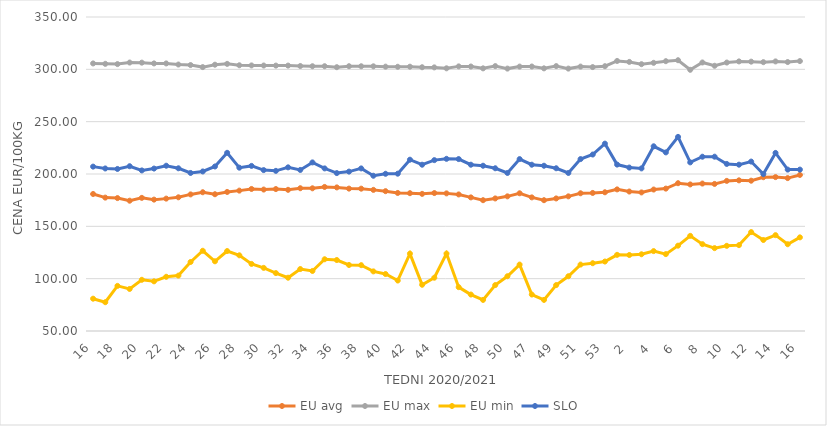
| Category | EU avg | EU max | EU min | SLO |
|---|---|---|---|---|
| 16.0 | 180.892 | 305.63 | 80.873 | 207.05 |
| 17.0 | 177.437 | 305.27 | 77.506 | 205.29 |
| 18.0 | 176.995 | 305.01 | 93.104 | 204.82 |
| 19.0 | 174.49 | 306.49 | 90.169 | 207.44 |
| 20.0 | 177.204 | 306.38 | 98.928 | 203.41 |
| 21.0 | 175.519 | 305.66 | 97.454 | 205.19 |
| 22.0 | 176.473 | 305.64 | 101.792 | 207.91 |
| 23.0 | 177.741 | 304.59 | 102.918 | 205.46 |
| 24.0 | 180.501 | 304.1 | 115.936 | 201 |
| 25.0 | 182.568 | 302.13 | 126.655 | 202.43 |
| 26.0 | 180.667 | 304.43 | 116.597 | 207.19 |
| 27.0 | 182.833 | 305.22 | 126.397 | 220.25 |
| 28.0 | 184.121 | 303.88 | 122.317 | 206.06 |
| 29.0 | 185.712 | 303.73 | 114.082 | 207.73 |
| 30.0 | 185.141 | 303.63 | 110.314 | 203.73 |
| 31.0 | 185.621 | 303.57 | 105.336 | 203 |
| 32.0 | 184.887 | 303.58 | 100.908 | 206.36 |
| 33.0 | 186.411 | 303.17 | 109.191 | 203.88 |
| 34.0 | 186.338 | 302.96 | 107.355 | 211.07 |
| 35.0 | 187.628 | 302.99 | 118.534 | 205.34 |
| 36.0 | 187.19 | 302.05 | 117.814 | 200.88 |
| 37.0 | 186.038 | 302.98 | 113.058 | 202.29 |
| 38.0 | 185.986 | 302.94 | 112.896 | 205.33 |
| 39.0 | 184.836 | 302.88 | 106.953 | 198.33 |
| 40.0 | 183.595 | 302.56 | 104.426 | 200.21 |
| 41.0 | 181.893 | 302.44 | 98.23 | 200.3 |
| 42.0 | 181.671 | 302.52 | 123.908 | 213.66 |
| 43.0 | 181.023 | 302.01 | 94.177 | 208.86 |
| 44.0 | 181.795 | 301.86 | 100.908 | 213.25 |
| 45.0 | 181.489 | 300.98 | 124 | 214.51 |
| 46.0 | 180.473 | 302.82 | 91.889 | 214.27 |
| 47.0 | 177.656 | 302.7 | 84.832 | 208.87 |
| 48.0 | 174.977 | 300.94 | 79.697 | 207.9 |
| 49.0 | 176.65 | 303.09 | 93.873 | 205.48 |
| 50.0 | 178.648 | 300.7 | 102.316 | 200.99 |
| 51.0 | 181.58 | 302.62 | 113.46 | 214.25 |
| 47.0 | 177.656 | 302.7 | 84.832 | 208.87 |
| 48.0 | 174.977 | 300.94 | 79.697 | 207.9 |
| 49.0 | 176.65 | 303.09 | 93.873 | 205.48 |
| 50.0 | 178.648 | 300.7 | 102.316 | 200.99 |
| 51.0 | 181.58 | 302.62 | 113.46 | 214.25 |
| 52.0 | 181.9 | 302.14 | 114.76 | 218.61 |
| 53.0 | 182.536 | 303 | 116.375 | 229 |
| 1.0 | 185.3 | 308 | 122.769 | 209 |
| 2.0 | 183.25 | 307.1 | 122.609 | 206.15 |
| 3.0 | 182.393 | 304.91 | 123.32 | 205.35 |
| 4.0 | 185.158 | 306.22 | 126.329 | 226.48 |
| 5.0 | 186.04 | 307.79 | 123.461 | 220.65 |
| 6.0 | 191.206 | 308.7 | 131.528 | 235.46 |
| 7.0 | 190.028 | 299.55 | 140.902 | 211.1 |
| 8.0 | 190.875 | 306.55 | 132.97 | 216.51 |
| 9.0 | 190.519 | 303.4 | 129.173 | 216.54 |
| 10.0 | 193.416 | 306.48 | 131.374 | 209.61 |
| 11.0 | 193.936 | 307.58 | 132.024 | 208.91 |
| 12.0 | 193.599 | 307.33 | 144.506 | 211.87 |
| 13.0 | 196.932 | 306.85 | 136.936 | 199.93 |
| 14.0 | 197.044 | 307.56 | 141.574 | 220.15 |
| 15.0 | 196.085 | 306.96 | 132.893 | 204.2 |
| 16.0 | 199.1 | 307.87 | 139.462 | 204.2 |